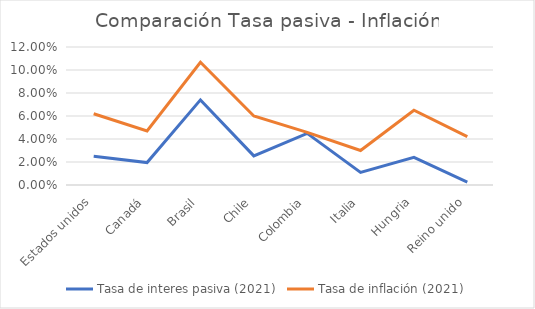
| Category | Tasa de interes pasiva (2021) | Tasa de inflación (2021) |
|---|---|---|
| Estados unidos | 0.025 | 0.062 |
| Canadá | 0.02 | 0.047 |
| Brasil | 0.074 | 0.107 |
| Chile | 0.025 | 0.06 |
| Colombia | 0.045 | 0.046 |
| Italia | 0.011 | 0.03 |
| Hungria | 0.024 | 0.065 |
| Reino unido | 0.002 | 0.042 |